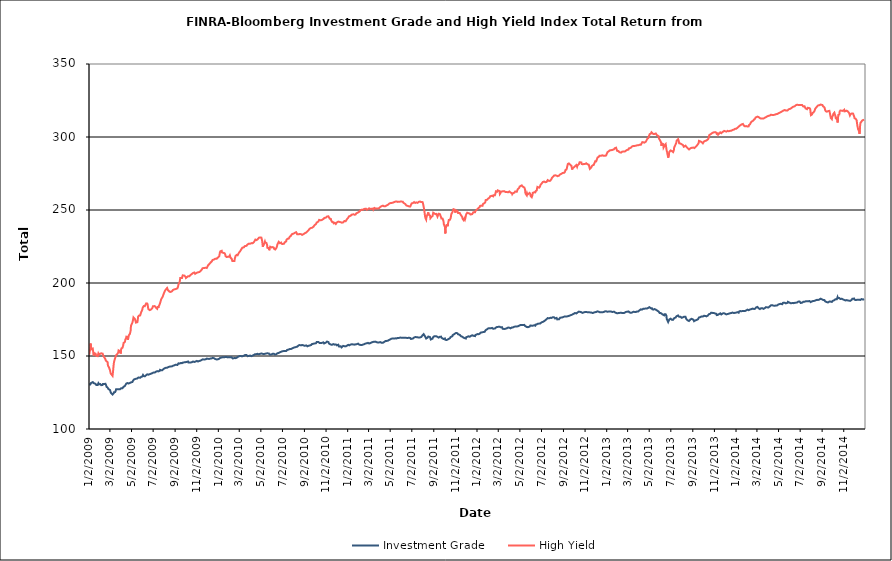
| Category | Investment Grade | High Yield |
|---|---|---|
| 1/2/09 | 130.456 | 150.901 |
| 1/5/09 | 130.524 | 154.964 |
| 1/6/09 | 131.132 | 158.55 |
| 1/7/09 | 131.476 | 157.922 |
| 1/8/09 | 131.509 | 154.548 |
| 1/9/09 | 131.899 | 155.038 |
| 1/12/09 | 132.115 | 155.09 |
| 1/13/09 | 131.98 | 153.446 |
| 1/14/09 | 131.914 | 151.292 |
| 1/15/09 | 131.418 | 150.346 |
| 1/16/09 | 131.612 | 151.994 |
| 1/20/09 | 130.898 | 151.643 |
| 1/21/09 | 130.622 | 151.062 |
| 1/22/09 | 130.169 | 150.114 |
| 1/23/09 | 130.063 | 149.528 |
| 1/26/09 | 130.187 | 149.884 |
| 1/27/09 | 130.757 | 149.946 |
| 1/28/09 | 131.377 | 151.826 |
| 1/29/09 | 130.895 | 151.693 |
| 1/30/09 | 130.625 | 150.956 |
| 2/2/09 | 130.793 | 151.521 |
| 2/3/09 | 130.475 | 151.444 |
| 2/4/09 | 130.138 | 151.704 |
| 2/5/09 | 130.041 | 151.868 |
| 2/6/09 | 130.096 | 151.844 |
| 2/9/09 | 130.196 | 151.59 |
| 2/10/09 | 130.887 | 151.416 |
| 2/11/09 | 131.304 | 150.069 |
| 2/12/09 | 131.194 | 149.768 |
| 2/13/09 | 130.865 | 149.475 |
| 2/17/09 | 130.943 | 147.774 |
| 2/18/09 | 130.406 | 146.817 |
| 2/19/09 | 129.793 | 147.231 |
| 2/20/09 | 128.916 | 146.211 |
| 2/23/09 | 128.37 | 145.794 |
| 2/24/09 | 127.803 | 143.43 |
| 2/25/09 | 127.426 | 143.418 |
| 2/26/09 | 127.198 | 143.76 |
| 2/27/09 | 127.049 | 142.136 |
| 3/2/09 | 126.633 | 140.033 |
| 3/3/09 | 126.067 | 138.861 |
| 3/4/09 | 124.893 | 137.909 |
| 3/5/09 | 124.609 | 137.847 |
| 3/6/09 | 124.444 | 137.385 |
| 3/9/09 | 123.603 | 136.385 |
| 3/10/09 | 123.655 | 138.532 |
| 3/11/09 | 124.014 | 141.298 |
| 3/12/09 | 124.461 | 143.754 |
| 3/13/09 | 125.17 | 145.832 |
| 3/16/09 | 125.255 | 148.411 |
| 3/17/09 | 125.417 | 148.524 |
| 3/18/09 | 126.205 | 148.925 |
| 3/19/09 | 127.235 | 150.542 |
| 3/20/09 | 126.981 | 150.136 |
| 3/23/09 | 127.143 | 151.604 |
| 3/24/09 | 127.1 | 151.748 |
| 3/25/09 | 127.075 | 152.349 |
| 3/26/09 | 127.22 | 153.846 |
| 3/27/09 | 127.5 | 154.41 |
| 3/30/09 | 127.215 | 153.244 |
| 3/31/09 | 127.458 | 153.056 |
| 4/1/09 | 127.54 | 151.638 |
| 4/2/09 | 127.858 | 154.221 |
| 4/3/09 | 127.69 | 155.167 |
| 4/6/09 | 127.941 | 155.661 |
| 4/7/09 | 128.085 | 156.435 |
| 4/8/09 | 128.571 | 157.282 |
| 4/9/09 | 128.913 | 158.84 |
| 4/13/09 | 129.49 | 159.761 |
| 4/14/09 | 130.04 | 161.2 |
| 4/15/09 | 130.452 | 161.157 |
| 4/16/09 | 130.89 | 162.163 |
| 4/17/09 | 131.156 | 163.249 |
| 4/20/09 | 131.458 | 163.078 |
| 4/21/09 | 131.255 | 161.127 |
| 4/22/09 | 130.991 | 161.853 |
| 4/23/09 | 131.156 | 162.265 |
| 4/24/09 | 131.448 | 164.314 |
| 4/27/09 | 131.544 | 165.134 |
| 4/28/09 | 131.549 | 165.558 |
| 4/29/09 | 131.771 | 167.449 |
| 4/30/09 | 131.931 | 170.695 |
| 5/1/09 | 131.967 | 171.124 |
| 5/4/09 | 132.202 | 172.922 |
| 5/5/09 | 132.638 | 173.874 |
| 5/6/09 | 133.139 | 175.093 |
| 5/7/09 | 133.502 | 176.426 |
| 5/8/09 | 133.846 | 176.351 |
| 5/11/09 | 134.164 | 175.384 |
| 5/12/09 | 134.441 | 174.909 |
| 5/13/09 | 134.576 | 173.862 |
| 5/14/09 | 134.423 | 172.898 |
| 5/15/09 | 134.684 | 172.875 |
| 5/18/09 | 134.628 | 173.172 |
| 5/19/09 | 134.731 | 174.565 |
| 5/20/09 | 135.279 | 176.814 |
| 5/21/09 | 135.281 | 177.011 |
| 5/22/09 | 135.232 | 177.614 |
| 5/26/09 | 135.122 | 177.787 |
| 5/27/09 | 135.109 | 178.662 |
| 5/28/09 | 135.037 | 179.161 |
| 5/29/09 | 135.789 | 180.117 |
| 6/1/09 | 135.929 | 181.755 |
| 6/2/09 | 136.467 | 183.068 |
| 6/3/09 | 137.008 | 183.074 |
| 6/4/09 | 136.751 | 183.18 |
| 6/5/09 | 136.256 | 184.222 |
| 6/8/09 | 136.087 | 184.131 |
| 6/9/09 | 136.334 | 184.338 |
| 6/10/09 | 136.37 | 185.155 |
| 6/11/09 | 136.679 | 185.691 |
| 6/12/09 | 137.069 | 186.029 |
| 6/15/09 | 137.447 | 185.922 |
| 6/16/09 | 137.536 | 185.222 |
| 6/17/09 | 137.588 | 183.478 |
| 6/18/09 | 137.196 | 182.137 |
| 6/19/09 | 137.28 | 182.406 |
| 6/22/09 | 137.56 | 181.418 |
| 6/23/09 | 137.675 | 181.047 |
| 6/24/09 | 137.663 | 181.662 |
| 6/25/09 | 137.841 | 181.764 |
| 6/26/09 | 138.148 | 182.259 |
| 6/29/09 | 138.212 | 182.695 |
| 6/30/09 | 138.199 | 183.418 |
| 7/1/09 | 138.338 | 184.147 |
| 7/2/09 | 138.614 | 184.518 |
| 7/6/09 | 138.639 | 184.164 |
| 7/7/09 | 138.83 | 184.232 |
| 7/8/09 | 139.235 | 183.552 |
| 7/9/09 | 139.219 | 183.283 |
| 7/10/09 | 139.459 | 183.161 |
| 7/13/09 | 139.614 | 182.328 |
| 7/14/09 | 139.447 | 182.985 |
| 7/15/09 | 139.134 | 184.133 |
| 7/16/09 | 139.44 | 183.072 |
| 7/17/09 | 139.508 | 183.923 |
| 7/20/09 | 139.826 | 185.422 |
| 7/21/09 | 140.532 | 186.133 |
| 7/22/09 | 140.549 | 186.258 |
| 7/23/09 | 140.265 | 187.842 |
| 7/24/09 | 140.235 | 188.784 |
| 7/27/09 | 140.241 | 189.994 |
| 7/28/09 | 140.546 | 190.525 |
| 7/29/09 | 140.825 | 190.972 |
| 7/30/09 | 140.931 | 191.652 |
| 7/31/09 | 141.596 | 192.396 |
| 8/3/09 | 141.598 | 194.166 |
| 8/4/09 | 141.658 | 194.633 |
| 8/5/09 | 141.833 | 194.773 |
| 8/6/09 | 141.89 | 195.532 |
| 8/7/09 | 141.685 | 196.147 |
| 8/10/09 | 142 | 196.565 |
| 8/11/09 | 142.22 | 196.26 |
| 8/12/09 | 142.022 | 195.203 |
| 8/13/09 | 142.374 | 195.364 |
| 8/14/09 | 142.717 | 195.22 |
| 8/17/09 | 142.709 | 193.999 |
| 8/18/09 | 142.745 | 194.058 |
| 8/19/09 | 142.782 | 193.578 |
| 8/20/09 | 142.855 | 193.879 |
| 8/21/09 | 142.676 | 193.944 |
| 8/24/09 | 142.923 | 194.371 |
| 8/25/09 | 143.181 | 194.706 |
| 8/26/09 | 143.397 | 195.118 |
| 8/27/09 | 143.367 | 195.376 |
| 8/28/09 | 143.458 | 195.784 |
| 8/31/09 | 143.651 | 195.702 |
| 9/1/09 | 143.764 | 196.012 |
| 9/2/09 | 143.95 | 195.849 |
| 9/3/09 | 144.062 | 195.85 |
| 9/4/09 | 144.013 | 196.249 |
| 9/8/09 | 143.842 | 196.32 |
| 9/9/09 | 143.816 | 196.903 |
| 9/10/09 | 144.422 | 197.708 |
| 9/11/09 | 144.954 | 199.024 |
| 9/14/09 | 144.784 | 200.449 |
| 9/15/09 | 144.87 | 201.668 |
| 9/16/09 | 145.077 | 203.376 |
| 9/17/09 | 145.163 | 203.225 |
| 9/18/09 | 145.178 | 203.449 |
| 9/21/09 | 145.104 | 203.398 |
| 9/22/09 | 145.178 | 204.464 |
| 9/23/09 | 145.291 | 205.26 |
| 9/24/09 | 145.54 | 205.056 |
| 9/25/09 | 145.466 | 204.834 |
| 9/28/09 | 145.678 | 205.029 |
| 9/29/09 | 145.639 | 205.239 |
| 9/30/09 | 145.562 | 204.688 |
| 10/1/09 | 145.797 | 204.177 |
| 10/2/09 | 145.834 | 203.433 |
| 10/5/09 | 145.996 | 204.013 |
| 10/6/09 | 146.011 | 204.636 |
| 10/7/09 | 146.196 | 204.343 |
| 10/8/09 | 146.221 | 204.647 |
| 10/9/09 | 145.532 | 204.609 |
| 10/12/09 | 145.532 | 204.674 |
| 10/13/09 | 145.867 | 204.684 |
| 10/14/09 | 145.709 | 205.33 |
| 10/15/09 | 145.52 | 205.501 |
| 10/16/09 | 145.607 | 205.842 |
| 10/19/09 | 145.776 | 206.212 |
| 10/20/09 | 146.295 | 206.698 |
| 10/21/09 | 146.128 | 206.858 |
| 10/22/09 | 146.196 | 206.873 |
| 10/23/09 | 146.066 | 206.892 |
| 10/26/09 | 145.902 | 207.187 |
| 10/27/09 | 146.185 | 207.004 |
| 10/28/09 | 146.469 | 206.288 |
| 10/29/09 | 146.193 | 206.142 |
| 10/30/09 | 146.59 | 206.237 |
| 11/2/09 | 146.64 | 207.057 |
| 11/3/09 | 146.39 | 206.57 |
| 11/4/09 | 146.221 | 206.902 |
| 11/5/09 | 146.236 | 207.278 |
| 11/6/09 | 146.445 | 207.203 |
| 11/9/09 | 146.634 | 207.531 |
| 11/10/09 | 146.805 | 207.885 |
| 11/11/09 | 146.589 | 208.128 |
| 11/12/09 | 146.802 | 208.108 |
| 11/13/09 | 146.932 | 208.309 |
| 11/16/09 | 147.389 | 209.277 |
| 11/17/09 | 147.605 | 209.729 |
| 11/18/09 | 147.63 | 210.137 |
| 11/19/09 | 147.722 | 210.127 |
| 11/20/09 | 147.644 | 210.131 |
| 11/23/09 | 147.571 | 210.276 |
| 11/24/09 | 147.8 | 210.41 |
| 11/25/09 | 147.828 | 210.711 |
| 11/27/09 | 147.758 | 210.509 |
| 11/30/09 | 148.234 | 210.268 |
| 12/1/09 | 148.215 | 210.7 |
| 12/2/09 | 148.218 | 211.242 |
| 12/3/09 | 148.048 | 211.956 |
| 12/4/09 | 147.63 | 212.174 |
| 12/7/09 | 148.001 | 212.95 |
| 12/8/09 | 148.314 | 213.098 |
| 12/9/09 | 148.379 | 213.287 |
| 12/10/09 | 148.268 | 213.83 |
| 12/11/09 | 148.096 | 214.144 |
| 12/14/09 | 148.369 | 214.803 |
| 12/15/09 | 148.247 | 215.353 |
| 12/16/09 | 148.348 | 215.754 |
| 12/17/09 | 148.73 | 215.943 |
| 12/18/09 | 148.822 | 215.797 |
| 12/21/09 | 148.384 | 216.16 |
| 12/22/09 | 148.029 | 216.437 |
| 12/23/09 | 148.052 | 216.453 |
| 12/24/09 | 147.9 | 216.689 |
| 12/28/09 | 147.631 | 216.669 |
| 12/29/09 | 147.668 | 216.976 |
| 12/30/09 | 147.94 | 217.137 |
| 12/31/09 | 147.73 | 217.398 |
| 1/4/10 | 148.138 | 218.276 |
| 1/5/10 | 148.728 | 219.533 |
| 1/6/10 | 148.687 | 220.973 |
| 1/7/10 | 148.791 | 221.667 |
| 1/8/10 | 148.871 | 221.768 |
| 1/11/10 | 148.965 | 222.058 |
| 1/12/10 | 149.302 | 220.936 |
| 1/13/10 | 149.169 | 221.002 |
| 1/14/10 | 149.16 | 220.851 |
| 1/15/10 | 149.443 | 220.69 |
| 1/19/10 | 149.142 | 220.408 |
| 1/20/10 | 149.341 | 220.144 |
| 1/21/10 | 149.537 | 219.594 |
| 1/22/10 | 149.358 | 218.364 |
| 1/25/10 | 149.258 | 217.768 |
| 1/26/10 | 149.302 | 217.635 |
| 1/27/10 | 149.185 | 218.028 |
| 1/28/10 | 149.057 | 217.984 |
| 1/29/10 | 149.097 | 217.958 |
| 2/1/10 | 149.11 | 218.038 |
| 2/2/10 | 149.242 | 218.46 |
| 2/3/10 | 149.11 | 218.924 |
| 2/4/10 | 149.181 | 218.611 |
| 2/5/10 | 149.188 | 217.3 |
| 2/8/10 | 149.118 | 216.652 |
| 2/9/10 | 148.96 | 216.199 |
| 2/10/10 | 148.733 | 215.145 |
| 2/11/10 | 148.306 | 214.966 |
| 2/12/10 | 148.631 | 215.187 |
| 2/16/10 | 148.612 | 215.148 |
| 2/17/10 | 148.607 | 216.754 |
| 2/18/10 | 148.543 | 217.542 |
| 2/19/10 | 148.518 | 218.407 |
| 2/22/10 | 148.735 | 219.255 |
| 2/23/10 | 149.048 | 218.904 |
| 2/24/10 | 149.199 | 219.077 |
| 2/25/10 | 149.317 | 219.009 |
| 2/26/10 | 149.72 | 219.579 |
| 3/1/10 | 149.806 | 220.874 |
| 3/2/10 | 149.879 | 221.253 |
| 3/3/10 | 149.999 | 221.505 |
| 3/4/10 | 150.058 | 221.754 |
| 3/5/10 | 149.837 | 222.349 |
| 3/8/10 | 149.871 | 223.336 |
| 3/9/10 | 149.986 | 223.623 |
| 3/10/10 | 149.839 | 224.107 |
| 3/11/10 | 149.843 | 224.21 |
| 3/12/10 | 150.118 | 224.465 |
| 3/15/10 | 150.237 | 224.508 |
| 3/16/10 | 150.455 | 224.314 |
| 3/17/10 | 150.685 | 225.249 |
| 3/18/10 | 150.697 | 225.602 |
| 3/19/10 | 150.695 | 225.533 |
| 3/22/10 | 150.701 | 225.49 |
| 3/23/10 | 150.774 | 225.713 |
| 3/24/10 | 150.157 | 226.224 |
| 3/25/10 | 149.904 | 226.327 |
| 3/26/10 | 149.978 | 226.844 |
| 3/29/10 | 150.108 | 226.98 |
| 3/30/10 | 150.193 | 227.317 |
| 3/31/10 | 150.422 | 227.06 |
| 4/1/10 | 150.302 | 226.854 |
| 4/5/10 | 149.89 | 227.336 |
| 4/6/10 | 149.886 | 227.114 |
| 4/7/10 | 150.166 | 227.482 |
| 4/8/10 | 150.222 | 227.201 |
| 4/9/10 | 150.367 | 227.559 |
| 4/12/10 | 150.743 | 228.013 |
| 4/13/10 | 150.977 | 228.362 |
| 4/14/10 | 151.082 | 228.862 |
| 4/15/10 | 151.197 | 229.417 |
| 4/16/10 | 151.43 | 229.746 |
| 4/19/10 | 151.29 | 229.378 |
| 4/20/10 | 151.303 | 229.613 |
| 4/21/10 | 151.516 | 229.922 |
| 4/22/10 | 151.505 | 229.786 |
| 4/23/10 | 151.187 | 230.343 |
| 4/26/10 | 151.183 | 231.026 |
| 4/27/10 | 151.518 | 230.985 |
| 4/28/10 | 151.375 | 230.656 |
| 4/29/10 | 151.484 | 231.163 |
| 4/30/10 | 151.823 | 231.044 |
| 5/3/10 | 151.714 | 231.082 |
| 5/4/10 | 151.911 | 230.704 |
| 5/5/10 | 151.871 | 229.082 |
| 5/6/10 | 151.518 | 226.956 |
| 5/7/10 | 150.982 | 224.839 |
| 5/10/10 | 151.305 | 226.831 |
| 5/11/10 | 151.261 | 226.496 |
| 5/12/10 | 151.206 | 227.638 |
| 5/13/10 | 151.488 | 228.391 |
| 5/14/10 | 151.808 | 227.589 |
| 5/17/10 | 151.785 | 227.491 |
| 5/18/10 | 151.962 | 227.398 |
| 5/19/10 | 151.883 | 226.231 |
| 5/20/10 | 151.828 | 224.056 |
| 5/21/10 | 151.576 | 223.475 |
| 5/24/10 | 151.744 | 224.018 |
| 5/25/10 | 151.254 | 222.441 |
| 5/26/10 | 151.228 | 223.388 |
| 5/27/10 | 150.909 | 224.158 |
| 5/28/10 | 151.267 | 224.872 |
| 6/1/10 | 151.166 | 224.359 |
| 6/2/10 | 151.005 | 224.369 |
| 6/3/10 | 151.087 | 224.964 |
| 6/4/10 | 151.536 | 224.598 |
| 6/7/10 | 151.568 | 224.254 |
| 6/8/10 | 151.449 | 223.379 |
| 6/9/10 | 151.431 | 223.411 |
| 6/10/10 | 151.033 | 223.391 |
| 6/11/10 | 151.068 | 222.938 |
| 6/14/10 | 151.168 | 223.8 |
| 6/15/10 | 151.237 | 224.435 |
| 6/16/10 | 151.35 | 225.145 |
| 6/17/10 | 151.85 | 226.255 |
| 6/18/10 | 151.95 | 226.827 |
| 6/21/10 | 152.099 | 228.18 |
| 6/22/10 | 152.336 | 227.899 |
| 6/23/10 | 152.544 | 227.893 |
| 6/24/10 | 152.505 | 227.317 |
| 6/25/10 | 152.512 | 227.529 |
| 6/28/10 | 152.919 | 227.662 |
| 6/29/10 | 153.088 | 226.881 |
| 6/30/10 | 153.256 | 227.281 |
| 7/1/10 | 153.26 | 226.657 |
| 7/2/10 | 153.296 | 226.726 |
| 7/6/10 | 153.401 | 226.935 |
| 7/7/10 | 153.275 | 227.239 |
| 7/8/10 | 153.332 | 227.914 |
| 7/9/10 | 153.346 | 228.3 |
| 7/12/10 | 153.406 | 228.5 |
| 7/13/10 | 153.508 | 229.676 |
| 7/14/10 | 153.54 | 229.747 |
| 7/15/10 | 154.186 | 230.02 |
| 7/16/10 | 154.45 | 230.311 |
| 7/19/10 | 154.421 | 230.396 |
| 7/20/10 | 154.571 | 230.597 |
| 7/21/10 | 154.713 | 230.948 |
| 7/22/10 | 154.81 | 231.615 |
| 7/23/10 | 154.787 | 232.159 |
| 7/26/10 | 154.819 | 232.551 |
| 7/27/10 | 154.919 | 233.167 |
| 7/28/10 | 154.953 | 233.424 |
| 7/29/10 | 155.219 | 233.158 |
| 7/30/10 | 155.681 | 233.528 |
| 8/2/10 | 155.664 | 233.845 |
| 8/3/10 | 155.934 | 234.218 |
| 8/4/10 | 155.819 | 234.224 |
| 8/5/10 | 155.907 | 234.331 |
| 8/6/10 | 156.202 | 234.611 |
| 8/9/10 | 156.185 | 234.826 |
| 8/10/10 | 156.305 | 234.462 |
| 8/11/10 | 156.415 | 234.013 |
| 8/12/10 | 156.375 | 233.324 |
| 8/13/10 | 156.5 | 233.036 |
| 8/16/10 | 157.283 | 233.307 |
| 8/17/10 | 157.199 | 233.51 |
| 8/18/10 | 157.299 | 233.735 |
| 8/19/10 | 157.491 | 233.606 |
| 8/20/10 | 157.371 | 233.25 |
| 8/23/10 | 157.306 | 233.433 |
| 8/24/10 | 157.642 | 233.185 |
| 8/25/10 | 157.604 | 233.111 |
| 8/26/10 | 157.53 | 232.964 |
| 8/27/10 | 157.001 | 233.13 |
| 8/30/10 | 157.269 | 233.482 |
| 8/31/10 | 157.502 | 233.106 |
| 9/1/10 | 157.137 | 233.487 |
| 9/2/10 | 156.997 | 233.998 |
| 9/3/10 | 156.836 | 234.431 |
| 9/7/10 | 157.25 | 234.672 |
| 9/8/10 | 157.273 | 234.77 |
| 9/9/10 | 156.872 | 235.138 |
| 9/10/10 | 156.635 | 235.369 |
| 9/13/10 | 157.002 | 236.122 |
| 9/14/10 | 157.428 | 236.022 |
| 9/15/10 | 157.367 | 236.341 |
| 9/16/10 | 157.163 | 237.106 |
| 9/17/10 | 157.231 | 237.261 |
| 9/20/10 | 157.459 | 237.686 |
| 9/21/10 | 157.688 | 238.039 |
| 9/22/10 | 158.121 | 238.12 |
| 9/23/10 | 158.207 | 237.83 |
| 9/24/10 | 157.946 | 237.943 |
| 9/27/10 | 158.387 | 238.553 |
| 9/28/10 | 158.5 | 238.76 |
| 9/29/10 | 158.556 | 239.176 |
| 9/30/10 | 158.574 | 239.596 |
| 10/1/10 | 158.719 | 239.917 |
| 10/4/10 | 158.723 | 240.343 |
| 10/5/10 | 158.915 | 240.842 |
| 10/6/10 | 159.572 | 241.409 |
| 10/7/10 | 159.662 | 241.712 |
| 10/8/10 | 159.778 | 242.02 |
| 10/11/10 | 159.647 | 242.1 |
| 10/12/10 | 159.547 | 242.33 |
| 10/13/10 | 159.368 | 243.238 |
| 10/14/10 | 158.936 | 243.015 |
| 10/15/10 | 158.56 | 242.955 |
| 10/18/10 | 158.841 | 242.956 |
| 10/19/10 | 159.018 | 242.909 |
| 10/20/10 | 159.081 | 242.726 |
| 10/21/10 | 159 | 243.221 |
| 10/22/10 | 158.985 | 243.231 |
| 10/25/10 | 159.316 | 243.831 |
| 10/26/10 | 158.883 | 244.418 |
| 10/27/10 | 158.57 | 244.341 |
| 10/28/10 | 158.749 | 244.582 |
| 10/29/10 | 159.062 | 244.452 |
| 11/1/10 | 159.158 | 244.733 |
| 11/2/10 | 159.471 | 244.362 |
| 11/3/10 | 159.656 | 244.821 |
| 11/4/10 | 159.896 | 245.495 |
| 11/5/10 | 159.653 | 245.54 |
| 11/8/10 | 159.578 | 245.717 |
| 11/9/10 | 159.213 | 245.828 |
| 11/10/10 | 158.489 | 244.84 |
| 11/11/10 | 158.591 | 244.793 |
| 11/12/10 | 158.389 | 244.031 |
| 11/15/10 | 157.814 | 243.894 |
| 11/16/10 | 157.664 | 242.835 |
| 11/17/10 | 157.963 | 242.423 |
| 11/18/10 | 157.658 | 242.693 |
| 11/19/10 | 157.922 | 241.761 |
| 11/22/10 | 158.162 | 241.668 |
| 11/23/10 | 158.357 | 240.889 |
| 11/24/10 | 157.748 | 240.806 |
| 11/26/10 | 157.77 | 241.172 |
| 11/29/10 | 157.93 | 240.436 |
| 11/30/10 | 158.106 | 240.163 |
| 12/1/10 | 157.436 | 240.816 |
| 12/2/10 | 157.319 | 241.508 |
| 12/3/10 | 157.409 | 241.776 |
| 12/6/10 | 157.748 | 242.064 |
| 12/7/10 | 157.248 | 242.309 |
| 12/8/10 | 156.543 | 241.78 |
| 12/9/10 | 156.743 | 241.89 |
| 12/10/10 | 156.679 | 241.503 |
| 12/13/10 | 156.633 | 241.636 |
| 12/14/10 | 156.258 | 241.537 |
| 12/15/10 | 155.875 | 241.161 |
| 12/16/10 | 155.864 | 241.32 |
| 12/17/10 | 156.338 | 241.362 |
| 12/20/10 | 156.934 | 241.546 |
| 12/21/10 | 156.801 | 242.022 |
| 12/22/10 | 156.866 | 242.026 |
| 12/23/10 | 156.734 | 242.402 |
| 12/27/10 | 156.592 | 242.345 |
| 12/28/10 | 156.46 | 242.906 |
| 12/29/10 | 156.734 | 243.104 |
| 12/30/10 | 157 | 243.491 |
| 12/31/10 | 157.322 | 243.889 |
| 1/3/11 | 157.626 | 244.716 |
| 1/4/11 | 157.815 | 245.187 |
| 1/5/11 | 157.257 | 245.618 |
| 1/6/11 | 157.308 | 245.993 |
| 1/7/11 | 157.728 | 245.896 |
| 1/10/11 | 157.85 | 246.09 |
| 1/11/11 | 157.862 | 246.402 |
| 1/12/11 | 157.794 | 246.55 |
| 1/13/11 | 158.013 | 246.81 |
| 1/14/11 | 158.143 | 246.922 |
| 1/18/11 | 157.91 | 247.078 |
| 1/19/11 | 158.148 | 247.099 |
| 1/20/11 | 157.779 | 246.707 |
| 1/21/11 | 157.772 | 246.716 |
| 1/24/11 | 157.98 | 246.961 |
| 1/25/11 | 158.258 | 247.578 |
| 1/26/11 | 158.002 | 247.765 |
| 1/27/11 | 158.085 | 248.289 |
| 1/28/11 | 158.333 | 247.918 |
| 1/31/11 | 158.463 | 248.319 |
| 2/1/11 | 158.167 | 248.646 |
| 2/2/11 | 158.091 | 248.934 |
| 2/3/11 | 157.788 | 248.813 |
| 2/4/11 | 157.483 | 249.293 |
| 2/7/11 | 157.584 | 249.856 |
| 2/8/11 | 157.563 | 250.164 |
| 2/9/11 | 157.528 | 250.282 |
| 2/10/11 | 157.543 | 250.22 |
| 2/11/11 | 157.651 | 250.083 |
| 2/14/11 | 157.832 | 250.194 |
| 2/15/11 | 157.905 | 250.283 |
| 2/16/11 | 157.966 | 250.519 |
| 2/17/11 | 158.084 | 250.733 |
| 2/18/11 | 158.064 | 250.911 |
| 2/22/11 | 158.645 | 250.896 |
| 2/23/11 | 158.66 | 250.602 |
| 2/24/11 | 158.475 | 250.152 |
| 2/25/11 | 158.728 | 250.286 |
| 2/28/11 | 159 | 250.537 |
| 3/1/11 | 159.151 | 250.931 |
| 3/2/11 | 159.145 | 251.083 |
| 3/3/11 | 158.534 | 251.151 |
| 3/4/11 | 158.722 | 250.995 |
| 3/7/11 | 158.888 | 250.721 |
| 3/8/11 | 158.73 | 251.313 |
| 3/9/11 | 158.992 | 251.345 |
| 3/10/11 | 159.281 | 250.84 |
| 3/11/11 | 159.453 | 250.74 |
| 3/14/11 | 159.639 | 250.996 |
| 3/15/11 | 159.696 | 250.261 |
| 3/16/11 | 160.006 | 250.243 |
| 3/17/11 | 159.744 | 250.739 |
| 3/18/11 | 159.878 | 251.393 |
| 3/21/11 | 159.836 | 251.043 |
| 3/22/11 | 159.827 | 251.203 |
| 3/23/11 | 159.71 | 250.998 |
| 3/24/11 | 159.495 | 251.104 |
| 3/25/11 | 159.317 | 250.991 |
| 3/28/11 | 159.199 | 251.006 |
| 3/29/11 | 159.016 | 251.066 |
| 3/30/11 | 159.023 | 251.431 |
| 3/31/11 | 159.304 | 251.272 |
| 4/1/11 | 159.072 | 251.92 |
| 4/4/11 | 159.53 | 252.238 |
| 4/5/11 | 159.285 | 252.698 |
| 4/6/11 | 159.11 | 252.56 |
| 4/7/11 | 159.049 | 252.574 |
| 4/8/11 | 159.041 | 252.811 |
| 4/11/11 | 159.06 | 252.995 |
| 4/12/11 | 159.391 | 252.709 |
| 4/13/11 | 159.584 | 252.682 |
| 4/14/11 | 159.56 | 252.554 |
| 4/15/11 | 159.954 | 252.893 |
| 4/18/11 | 160.215 | 252.622 |
| 4/19/11 | 160.381 | 252.671 |
| 4/20/11 | 160.362 | 252.88 |
| 4/21/11 | 160.327 | 253.09 |
| 4/25/11 | 160.449 | 253.534 |
| 4/26/11 | 160.774 | 253.773 |
| 4/27/11 | 160.593 | 253.724 |
| 4/28/11 | 160.972 | 254.275 |
| 4/29/11 | 161.184 | 254.364 |
| 5/2/11 | 161.378 | 254.711 |
| 5/3/11 | 161.544 | 254.53 |
| 5/4/11 | 161.69 | 254.875 |
| 5/5/11 | 161.863 | 254.808 |
| 5/6/11 | 161.867 | 255.155 |
| 5/9/11 | 162.019 | 255.013 |
| 5/10/11 | 161.844 | 255.551 |
| 5/11/11 | 161.91 | 255.621 |
| 5/12/11 | 161.919 | 255.348 |
| 5/13/11 | 162.003 | 255.328 |
| 5/16/11 | 162.092 | 255.735 |
| 5/17/11 | 162.436 | 255.698 |
| 5/18/11 | 162.239 | 255.708 |
| 5/19/11 | 162.04 | 255.887 |
| 5/20/11 | 162.161 | 255.759 |
| 5/23/11 | 162.38 | 255.548 |
| 5/24/11 | 162.266 | 255.706 |
| 5/25/11 | 162.212 | 255.594 |
| 5/26/11 | 162.355 | 255.674 |
| 5/27/11 | 162.427 | 256.036 |
| 5/31/11 | 162.634 | 255.76 |
| 6/1/11 | 162.928 | 255.849 |
| 6/2/11 | 162.566 | 255.591 |
| 6/3/11 | 162.489 | 255.756 |
| 6/6/11 | 162.453 | 255.667 |
| 6/7/11 | 162.401 | 255.356 |
| 6/8/11 | 162.584 | 254.91 |
| 6/9/11 | 162.504 | 254.704 |
| 6/10/11 | 162.479 | 254.634 |
| 6/13/11 | 162.452 | 254.118 |
| 6/14/11 | 162.032 | 253.948 |
| 6/15/11 | 162.272 | 253.687 |
| 6/16/11 | 162.422 | 253.138 |
| 6/17/11 | 162.412 | 253.373 |
| 6/20/11 | 162.37 | 252.794 |
| 6/21/11 | 162.429 | 252.839 |
| 6/22/11 | 162.449 | 253.214 |
| 6/23/11 | 162.527 | 252.527 |
| 6/24/11 | 162.699 | 252.693 |
| 6/27/11 | 162.361 | 252.368 |
| 6/28/11 | 161.852 | 253.028 |
| 6/29/11 | 161.652 | 253.4 |
| 6/30/11 | 161.582 | 253.619 |
| 7/1/11 | 161.664 | 254.51 |
| 7/5/11 | 162.021 | 254.798 |
| 7/6/11 | 162.135 | 255.008 |
| 7/7/11 | 161.984 | 255.276 |
| 7/8/11 | 162.646 | 255.417 |
| 7/11/11 | 162.928 | 254.826 |
| 7/12/11 | 163.078 | 254.68 |
| 7/13/11 | 163.147 | 255.054 |
| 7/14/11 | 162.932 | 255.182 |
| 7/15/11 | 162.894 | 254.981 |
| 7/18/11 | 162.779 | 254.861 |
| 7/19/11 | 162.716 | 254.905 |
| 7/20/11 | 162.937 | 255.359 |
| 7/21/11 | 162.64 | 255.583 |
| 7/22/11 | 162.835 | 255.706 |
| 7/25/11 | 162.739 | 255.818 |
| 7/26/11 | 162.87 | 256.239 |
| 7/27/11 | 162.9 | 255.731 |
| 7/28/11 | 162.985 | 255.399 |
| 7/29/11 | 163.627 | 255.056 |
| 8/1/11 | 164.219 | 255.393 |
| 8/2/11 | 164.63 | 254.416 |
| 8/3/11 | 164.773 | 253.433 |
| 8/4/11 | 164.945 | 252.108 |
| 8/5/11 | 164.443 | 251.097 |
| 8/8/11 | 163.395 | 245.602 |
| 8/9/11 | 163.141 | 244.507 |
| 8/10/11 | 163.204 | 244.486 |
| 8/11/11 | 161.985 | 243.45 |
| 8/12/11 | 162.398 | 245.222 |
| 8/15/11 | 162.572 | 247.051 |
| 8/16/11 | 162.936 | 247.363 |
| 8/17/11 | 163.319 | 248.419 |
| 8/18/11 | 163.44 | 246.821 |
| 8/19/11 | 163.205 | 246.281 |
| 8/22/11 | 162.937 | 246.179 |
| 8/23/11 | 162.18 | 244.365 |
| 8/24/11 | 161.334 | 243.738 |
| 8/25/11 | 161.636 | 244.871 |
| 8/26/11 | 161.888 | 245.33 |
| 8/29/11 | 161.931 | 245.795 |
| 8/30/11 | 162.637 | 246.122 |
| 8/31/11 | 162.878 | 248.155 |
| 9/1/11 | 163.171 | 248.397 |
| 9/2/11 | 163.433 | 248.749 |
| 9/6/11 | 163.525 | 247.181 |
| 9/7/11 | 163.501 | 247.704 |
| 9/8/11 | 163.55 | 247.68 |
| 9/9/11 | 163.455 | 247.331 |
| 9/12/11 | 163.134 | 245.486 |
| 9/13/11 | 162.81 | 245.818 |
| 9/14/11 | 162.872 | 246.767 |
| 9/15/11 | 162.604 | 247.229 |
| 9/16/11 | 162.758 | 247.457 |
| 9/19/11 | 163.176 | 247.147 |
| 9/20/11 | 163.198 | 247.421 |
| 9/21/11 | 163.313 | 247.136 |
| 9/22/11 | 163.267 | 245.042 |
| 9/23/11 | 162.556 | 244.18 |
| 9/26/11 | 162.073 | 244.218 |
| 9/27/11 | 161.715 | 244.546 |
| 9/28/11 | 161.525 | 243.141 |
| 9/29/11 | 161.625 | 242.219 |
| 9/30/11 | 161.689 | 240.219 |
| 10/3/11 | 162.004 | 238.38 |
| 10/4/11 | 161.143 | 233.908 |
| 10/5/11 | 160.886 | 235.671 |
| 10/6/11 | 160.951 | 238.602 |
| 10/7/11 | 160.961 | 239.592 |
| 10/10/11 | 161.166 | 239.899 |
| 10/11/11 | 160.928 | 238.887 |
| 10/12/11 | 161.23 | 241 |
| 10/13/11 | 161.659 | 241.617 |
| 10/14/11 | 161.731 | 243.19 |
| 10/17/11 | 162.158 | 243.24 |
| 10/18/11 | 162.533 | 243.056 |
| 10/19/11 | 163.006 | 244.34 |
| 10/20/11 | 163.27 | 245.545 |
| 10/21/11 | 163.339 | 247.234 |
| 10/24/11 | 163.572 | 248.376 |
| 10/25/11 | 164.328 | 248.912 |
| 10/26/11 | 164.52 | 248.238 |
| 10/27/11 | 164.511 | 250.561 |
| 10/28/11 | 164.72 | 250.417 |
| 10/31/11 | 165.306 | 250.216 |
| 11/1/11 | 165.588 | 248.202 |
| 11/2/11 | 165.878 | 248.888 |
| 11/3/11 | 165.715 | 249.704 |
| 11/4/11 | 165.525 | 249.34 |
| 11/7/11 | 165.647 | 249.362 |
| 11/8/11 | 165.175 | 249.684 |
| 11/9/11 | 164.87 | 247.965 |
| 11/10/11 | 164.546 | 248.191 |
| 11/11/11 | 164.675 | 248.388 |
| 11/14/11 | 164.476 | 247.916 |
| 11/15/11 | 164.016 | 247.289 |
| 11/16/11 | 164.031 | 246.969 |
| 11/17/11 | 163.585 | 246.641 |
| 11/18/11 | 163.519 | 246.23 |
| 11/21/11 | 163.224 | 245.092 |
| 11/22/11 | 162.875 | 243.879 |
| 11/23/11 | 162.664 | 243.793 |
| 11/25/11 | 162.461 | 242.969 |
| 11/28/11 | 162.222 | 244.54 |
| 11/29/11 | 162.156 | 243.804 |
| 11/30/11 | 162.163 | 244.618 |
| 12/1/11 | 161.972 | 246.167 |
| 12/2/11 | 162.826 | 247.051 |
| 12/5/11 | 163.133 | 248.137 |
| 12/6/11 | 163.241 | 248.226 |
| 12/7/11 | 163.212 | 247.919 |
| 12/8/11 | 163.503 | 247.823 |
| 12/9/11 | 163.137 | 247.71 |
| 12/12/11 | 163.2 | 247.591 |
| 12/13/11 | 163.288 | 247.331 |
| 12/14/11 | 163.464 | 246.905 |
| 12/15/11 | 163.704 | 247.047 |
| 12/16/11 | 164.017 | 247.285 |
| 12/19/11 | 164.19 | 247.198 |
| 12/20/11 | 163.925 | 247.708 |
| 12/21/11 | 163.789 | 247.851 |
| 12/22/11 | 163.874 | 248.444 |
| 12/23/11 | 163.706 | 248.74 |
| 12/27/11 | 163.62 | 248.467 |
| 12/28/11 | 164.409 | 249.294 |
| 12/29/11 | 164.65 | 249.693 |
| 12/30/11 | 165.028 | 249.97 |
| 1/3/12 | 165 | 250.715 |
| 1/4/12 | 164.79 | 250.779 |
| 1/5/12 | 164.735 | 251.086 |
| 1/6/12 | 164.96 | 251.448 |
| 1/9/12 | 165.268 | 251.961 |
| 1/10/12 | 165.441 | 252.742 |
| 1/11/12 | 165.803 | 252.832 |
| 1/12/12 | 166.032 | 253.184 |
| 1/13/12 | 166.183 | 253.02 |
| 1/17/12 | 166.274 | 252.866 |
| 1/18/12 | 166.444 | 253.06 |
| 1/19/12 | 166.456 | 254.263 |
| 1/20/12 | 166.437 | 254.397 |
| 1/23/12 | 166.529 | 254.743 |
| 1/24/12 | 166.417 | 254.88 |
| 1/25/12 | 166.929 | 255.446 |
| 1/26/12 | 167.686 | 256.822 |
| 1/27/12 | 167.976 | 256.959 |
| 1/30/12 | 168.315 | 257.005 |
| 1/31/12 | 168.58 | 256.808 |
| 2/1/12 | 168.573 | 257.523 |
| 2/2/12 | 168.91 | 257.778 |
| 2/3/12 | 168.745 | 257.951 |
| 2/6/12 | 169.019 | 258.538 |
| 2/7/12 | 168.872 | 258.607 |
| 2/8/12 | 169.153 | 259.455 |
| 2/9/12 | 168.938 | 259.817 |
| 2/10/12 | 169.066 | 259.132 |
| 2/13/12 | 169.249 | 259.743 |
| 2/14/12 | 169.29 | 259.486 |
| 2/15/12 | 169.329 | 259.581 |
| 2/16/12 | 168.702 | 259.357 |
| 2/17/12 | 168.808 | 260.074 |
| 2/21/12 | 168.807 | 260.076 |
| 2/22/12 | 169.006 | 260.884 |
| 2/23/12 | 169.182 | 261.495 |
| 2/24/12 | 169.517 | 262.8 |
| 2/27/12 | 169.832 | 262.498 |
| 2/28/12 | 170.084 | 262.863 |
| 2/29/12 | 170.208 | 263.462 |
| 3/1/12 | 169.958 | 263.656 |
| 3/2/12 | 170.404 | 263.482 |
| 3/5/12 | 170.096 | 262.963 |
| 3/6/12 | 169.911 | 260.954 |
| 3/7/12 | 169.867 | 261.475 |
| 3/8/12 | 169.702 | 261.711 |
| 3/9/12 | 169.585 | 262.512 |
| 3/12/12 | 169.759 | 262.676 |
| 3/13/12 | 169.338 | 262.921 |
| 3/14/12 | 168.604 | 263.168 |
| 3/15/12 | 168.553 | 262.878 |
| 3/16/12 | 168.639 | 262.992 |
| 3/19/12 | 168.542 | 262.878 |
| 3/20/12 | 168.348 | 262.477 |
| 3/21/12 | 168.765 | 262.877 |
| 3/22/12 | 168.674 | 262.254 |
| 3/23/12 | 168.965 | 262.017 |
| 3/26/12 | 169.026 | 262.319 |
| 3/27/12 | 169.446 | 262.573 |
| 3/28/12 | 169.432 | 262.566 |
| 3/29/12 | 169.464 | 262.104 |
| 3/30/12 | 169.412 | 262.581 |
| 4/2/12 | 169.408 | 262.705 |
| 4/3/12 | 169.271 | 262.827 |
| 4/4/12 | 168.83 | 262.433 |
| 4/5/12 | 168.956 | 262 |
| 4/9/12 | 169.563 | 261.491 |
| 4/10/12 | 169.66 | 260.789 |
| 4/11/12 | 169.504 | 260.797 |
| 4/12/12 | 169.575 | 261.504 |
| 4/13/12 | 169.893 | 261.894 |
| 4/16/12 | 170.079 | 261.862 |
| 4/17/12 | 169.995 | 262.478 |
| 4/18/12 | 170.068 | 262.661 |
| 4/19/12 | 170.194 | 262.593 |
| 4/20/12 | 170.075 | 262.792 |
| 4/23/12 | 170.258 | 262.506 |
| 4/24/12 | 170.151 | 263.114 |
| 4/25/12 | 170.052 | 263.997 |
| 4/26/12 | 170.32 | 264.193 |
| 4/27/12 | 170.504 | 264.573 |
| 4/30/12 | 170.798 | 265.38 |
| 5/1/12 | 170.791 | 266.079 |
| 5/2/12 | 171.05 | 266.388 |
| 5/3/12 | 171.183 | 266.464 |
| 5/4/12 | 171.332 | 266.529 |
| 5/7/12 | 171.284 | 266.86 |
| 5/8/12 | 171.473 | 266.486 |
| 5/9/12 | 171.253 | 266.124 |
| 5/10/12 | 171.161 | 266.473 |
| 5/11/12 | 171.321 | 266.48 |
| 5/14/12 | 171.318 | 265.403 |
| 5/15/12 | 171.144 | 265.259 |
| 5/16/12 | 170.604 | 264.152 |
| 5/17/12 | 170.27 | 261.717 |
| 5/18/12 | 169.962 | 260.994 |
| 5/21/12 | 169.887 | 259.995 |
| 5/22/12 | 169.745 | 261.241 |
| 5/23/12 | 169.888 | 260.549 |
| 5/24/12 | 169.74 | 260.698 |
| 5/25/12 | 169.974 | 261.09 |
| 5/29/12 | 170.104 | 261.678 |
| 5/30/12 | 170.523 | 261.215 |
| 5/31/12 | 170.894 | 260.94 |
| 6/1/12 | 171.018 | 259.478 |
| 6/4/12 | 170.775 | 258.736 |
| 6/5/12 | 170.482 | 258.384 |
| 6/6/12 | 170.426 | 260.187 |
| 6/7/12 | 170.775 | 261.74 |
| 6/8/12 | 170.965 | 261.457 |
| 6/11/12 | 171.032 | 262.151 |
| 6/12/12 | 170.646 | 261.8 |
| 6/13/12 | 170.807 | 262.045 |
| 6/14/12 | 170.791 | 262.064 |
| 6/15/12 | 171.482 | 262.908 |
| 6/18/12 | 171.637 | 263.399 |
| 6/19/12 | 171.659 | 264.743 |
| 6/20/12 | 171.768 | 265.827 |
| 6/21/12 | 172.115 | 265.94 |
| 6/22/12 | 172.025 | 265.728 |
| 6/25/12 | 172.199 | 265.279 |
| 6/26/12 | 172.058 | 265.524 |
| 6/27/12 | 172.152 | 265.968 |
| 6/28/12 | 172.304 | 266.213 |
| 6/29/12 | 172.257 | 267.309 |
| 7/2/12 | 173.09 | 268.096 |
| 7/3/12 | 173.221 | 268.752 |
| 7/5/12 | 173.316 | 269.146 |
| 7/6/12 | 173.56 | 269.538 |
| 7/9/12 | 173.833 | 269.493 |
| 7/10/12 | 174.086 | 269.579 |
| 7/11/12 | 174.259 | 269.722 |
| 7/12/12 | 174.453 | 269.04 |
| 7/13/12 | 174.699 | 269.154 |
| 7/16/12 | 175.24 | 269.239 |
| 7/17/12 | 175.328 | 269.334 |
| 7/18/12 | 175.845 | 269.69 |
| 7/19/12 | 175.973 | 270.505 |
| 7/20/12 | 175.936 | 270.235 |
| 7/23/12 | 175.822 | 269.894 |
| 7/24/12 | 176.004 | 269.604 |
| 7/25/12 | 176.025 | 269.406 |
| 7/26/12 | 176.118 | 270.041 |
| 7/27/12 | 175.687 | 270.63 |
| 7/30/12 | 176.107 | 271.303 |
| 7/31/12 | 176.44 | 272.05 |
| 8/1/12 | 176.338 | 272.672 |
| 8/2/12 | 176.512 | 272.465 |
| 8/3/12 | 176.119 | 272.799 |
| 8/6/12 | 176.532 | 273.572 |
| 8/7/12 | 176.104 | 274.005 |
| 8/8/12 | 175.944 | 273.748 |
| 8/9/12 | 175.686 | 273.786 |
| 8/10/12 | 176.002 | 273.401 |
| 8/13/12 | 176.09 | 273.532 |
| 8/14/12 | 175.65 | 273.594 |
| 8/15/12 | 175.071 | 273.101 |
| 8/16/12 | 174.906 | 273.147 |
| 8/17/12 | 174.987 | 273.072 |
| 8/20/12 | 175.143 | 273.57 |
| 8/21/12 | 175.21 | 274.034 |
| 8/22/12 | 175.778 | 274.203 |
| 8/23/12 | 176.169 | 274.362 |
| 8/24/12 | 176.127 | 274.551 |
| 8/27/12 | 176.358 | 274.825 |
| 8/28/12 | 176.454 | 275.031 |
| 8/29/12 | 176.284 | 274.914 |
| 8/30/12 | 176.477 | 275.32 |
| 8/31/12 | 176.81 | 275.392 |
| 9/4/12 | 177.032 | 275.567 |
| 9/5/12 | 176.91 | 275.631 |
| 9/6/12 | 176.68 | 276.312 |
| 9/7/12 | 177.103 | 277.344 |
| 9/10/12 | 177.002 | 277.72 |
| 9/11/12 | 177.098 | 278.556 |
| 9/12/12 | 177.05 | 279.736 |
| 9/13/12 | 177.212 | 280.396 |
| 9/14/12 | 177.169 | 281.535 |
| 9/17/12 | 177.454 | 281.887 |
| 9/18/12 | 177.646 | 281.586 |
| 9/19/12 | 177.912 | 281.618 |
| 9/20/12 | 177.78 | 281.149 |
| 9/21/12 | 177.838 | 281.063 |
| 9/24/12 | 178.1 | 280.276 |
| 9/25/12 | 178.087 | 279.718 |
| 9/26/12 | 178.216 | 277.714 |
| 9/27/12 | 178.469 | 278.535 |
| 9/28/12 | 178.688 | 278.908 |
| 10/1/12 | 178.975 | 279.276 |
| 10/2/12 | 179.149 | 279.208 |
| 10/3/12 | 179.331 | 279.587 |
| 10/4/12 | 179.471 | 279.992 |
| 10/5/12 | 179.287 | 280.375 |
| 10/8/12 | 179.17 | 280.811 |
| 10/9/12 | 179.42 | 280.214 |
| 10/10/12 | 179.403 | 279.596 |
| 10/11/12 | 179.787 | 280.444 |
| 10/12/12 | 180.286 | 280.729 |
| 10/15/12 | 180.386 | 281.353 |
| 10/16/12 | 180.411 | 281.917 |
| 10/17/12 | 180.427 | 282.705 |
| 10/18/12 | 180.252 | 282.93 |
| 10/19/12 | 180.181 | 282.592 |
| 10/22/12 | 179.984 | 282.579 |
| 10/23/12 | 179.808 | 281.491 |
| 10/24/12 | 179.787 | 281.88 |
| 10/25/12 | 179.532 | 282.013 |
| 10/26/12 | 179.776 | 281.343 |
| 10/29/12 | 179.874 | 281.464 |
| 10/30/12 | 179.896 | 281.521 |
| 10/31/12 | 180.158 | 281.409 |
| 11/1/12 | 180.105 | 281.505 |
| 11/2/12 | 180.019 | 281.845 |
| 11/5/12 | 180.13 | 282.006 |
| 11/6/12 | 179.794 | 282.389 |
| 11/7/12 | 179.95 | 281.412 |
| 11/8/12 | 180.011 | 281.342 |
| 11/9/12 | 179.956 | 280.712 |
| 11/12/12 | 179.993 | 281.011 |
| 11/13/12 | 180.036 | 279.914 |
| 11/14/12 | 180.015 | 279.447 |
| 11/15/12 | 179.863 | 278.145 |
| 11/16/12 | 179.799 | 277.878 |
| 11/19/12 | 179.795 | 279.127 |
| 11/20/12 | 179.615 | 279.948 |
| 11/21/12 | 179.343 | 280.164 |
| 11/23/12 | 179.415 | 280.637 |
| 11/26/12 | 179.727 | 280.898 |
| 11/27/12 | 179.835 | 281.598 |
| 11/28/12 | 179.951 | 281.767 |
| 11/29/12 | 179.975 | 282.593 |
| 11/30/12 | 180.118 | 283.394 |
| 12/3/12 | 180.152 | 283.319 |
| 12/4/12 | 180.225 | 283.828 |
| 12/5/12 | 180.496 | 284.899 |
| 12/6/12 | 180.562 | 285.395 |
| 12/7/12 | 180.315 | 286.027 |
| 12/10/12 | 180.348 | 286.385 |
| 12/11/12 | 180.223 | 286.768 |
| 12/12/12 | 180.123 | 287.14 |
| 12/13/12 | 179.907 | 287.331 |
| 12/14/12 | 180.071 | 287.179 |
| 12/17/12 | 179.933 | 287.169 |
| 12/18/12 | 179.627 | 287.436 |
| 12/19/12 | 179.934 | 287.562 |
| 12/20/12 | 179.999 | 287.474 |
| 12/21/12 | 180.203 | 286.963 |
| 12/24/12 | 180.079 | 287.133 |
| 12/26/12 | 180.197 | 286.749 |
| 12/27/12 | 180.542 | 287.091 |
| 12/28/12 | 180.711 | 287.206 |
| 12/31/12 | 180.615 | 287.373 |
| 1/2/13 | 180.418 | 288.714 |
| 1/3/13 | 180.314 | 289.229 |
| 1/4/13 | 180.218 | 289.691 |
| 1/7/13 | 180.416 | 290.115 |
| 1/8/13 | 180.534 | 290.229 |
| 1/9/13 | 180.497 | 290.492 |
| 1/10/13 | 180.403 | 290.811 |
| 1/11/13 | 180.366 | 291.068 |
| 1/14/13 | 180.474 | 290.972 |
| 1/15/13 | 180.457 | 290.556 |
| 1/16/13 | 180.451 | 290.825 |
| 1/17/13 | 180.126 | 291.101 |
| 1/18/13 | 180.262 | 291.424 |
| 1/22/13 | 180.359 | 291.542 |
| 1/23/13 | 180.414 | 291.942 |
| 1/24/13 | 180.258 | 292.239 |
| 1/25/13 | 179.88 | 292.639 |
| 1/28/13 | 179.528 | 292.699 |
| 1/29/13 | 179.475 | 291.968 |
| 1/30/13 | 179.216 | 291.435 |
| 1/31/13 | 179.282 | 290.547 |
| 2/1/13 | 179.319 | 290.795 |
| 2/4/13 | 179.396 | 290.328 |
| 2/5/13 | 179.186 | 289.927 |
| 2/6/13 | 179.33 | 289.626 |
| 2/7/13 | 179.53 | 289.348 |
| 2/8/13 | 179.424 | 289.123 |
| 2/11/13 | 179.601 | 289.312 |
| 2/12/13 | 179.432 | 289.517 |
| 2/13/13 | 179.276 | 289.685 |
| 2/14/13 | 179.47 | 289.903 |
| 2/15/13 | 179.428 | 289.938 |
| 2/19/13 | 179.436 | 290.138 |
| 2/20/13 | 179.393 | 290.311 |
| 2/21/13 | 179.67 | 289.894 |
| 2/22/13 | 179.791 | 290.126 |
| 2/25/13 | 180.195 | 290.674 |
| 2/26/13 | 180.36 | 290.49 |
| 2/27/13 | 180.275 | 290.647 |
| 2/28/13 | 180.295 | 291.129 |
| 3/1/13 | 180.498 | 291.056 |
| 3/4/13 | 180.547 | 291.371 |
| 3/5/13 | 180.405 | 292.183 |
| 3/6/13 | 180.162 | 292.263 |
| 3/7/13 | 179.864 | 292.342 |
| 3/8/13 | 179.491 | 292.364 |
| 3/11/13 | 179.561 | 292.71 |
| 3/12/13 | 179.833 | 292.986 |
| 3/13/13 | 179.763 | 292.997 |
| 3/14/13 | 179.781 | 293.521 |
| 3/15/13 | 180.017 | 293.66 |
| 3/18/13 | 180.309 | 293.843 |
| 3/19/13 | 180.56 | 293.925 |
| 3/20/13 | 180.234 | 294.009 |
| 3/21/13 | 180.19 | 293.882 |
| 3/22/13 | 180.169 | 293.97 |
| 3/25/13 | 180.202 | 294.027 |
| 3/26/13 | 180.105 | 293.998 |
| 3/27/13 | 180.419 | 294.128 |
| 3/28/13 | 180.443 | 294.272 |
| 4/1/13 | 180.531 | 294.371 |
| 4/2/13 | 180.461 | 294.579 |
| 4/3/13 | 180.789 | 294.607 |
| 4/4/13 | 181.285 | 294.648 |
| 4/5/13 | 181.945 | 294.632 |
| 4/8/13 | 182.004 | 294.735 |
| 4/9/13 | 182.049 | 295.329 |
| 4/10/13 | 181.764 | 295.607 |
| 4/11/13 | 181.777 | 296.149 |
| 4/12/13 | 182.134 | 296.506 |
| 4/15/13 | 182.382 | 296.343 |
| 4/16/13 | 182.309 | 296.556 |
| 4/17/13 | 182.364 | 296.241 |
| 4/18/13 | 182.416 | 296.14 |
| 4/19/13 | 182.332 | 296.394 |
| 4/22/13 | 182.498 | 296.78 |
| 4/23/13 | 182.612 | 297.392 |
| 4/24/13 | 182.699 | 297.751 |
| 4/25/13 | 182.517 | 298.19 |
| 4/26/13 | 182.907 | 298.71 |
| 4/29/13 | 183.005 | 299.268 |
| 4/30/13 | 183.021 | 300.067 |
| 5/1/13 | 183.331 | 300.856 |
| 5/2/13 | 183.461 | 301.386 |
| 5/3/13 | 182.88 | 301.968 |
| 5/6/13 | 182.703 | 302.267 |
| 5/7/13 | 182.682 | 302.749 |
| 5/8/13 | 182.755 | 303.216 |
| 5/9/13 | 182.747 | 303.174 |
| 5/10/13 | 182.048 | 302.716 |
| 5/13/13 | 181.775 | 302.027 |
| 5/14/13 | 181.74 | 301.767 |
| 5/15/13 | 181.725 | 301.705 |
| 5/16/13 | 182.182 | 302.013 |
| 5/17/13 | 181.879 | 302.136 |
| 5/20/13 | 181.74 | 302.424 |
| 5/21/13 | 181.831 | 302.406 |
| 5/22/13 | 181.51 | 302.291 |
| 5/23/13 | 181.254 | 301.321 |
| 5/24/13 | 181.269 | 300.988 |
| 5/28/13 | 180.478 | 300.573 |
| 5/29/13 | 179.983 | 298.941 |
| 5/30/13 | 179.917 | 298.874 |
| 5/31/13 | 179.394 | 298.159 |
| 6/3/13 | 179.454 | 296.868 |
| 6/4/13 | 179.162 | 296.146 |
| 6/5/13 | 178.829 | 293.959 |
| 6/6/13 | 178.861 | 293.342 |
| 6/7/13 | 178.695 | 295.478 |
| 6/10/13 | 178.13 | 295.107 |
| 6/11/13 | 177.577 | 292.825 |
| 6/12/13 | 177.663 | 293.39 |
| 6/13/13 | 177.842 | 292.841 |
| 6/14/13 | 178.613 | 294.18 |
| 6/17/13 | 178.554 | 295.091 |
| 6/18/13 | 178.04 | 294.81 |
| 6/19/13 | 177.631 | 294.581 |
| 6/20/13 | 175.366 | 290.384 |
| 6/21/13 | 174.752 | 289.646 |
| 6/24/13 | 173.249 | 285.828 |
| 6/25/13 | 173.543 | 286.221 |
| 6/26/13 | 174.232 | 287.65 |
| 6/27/13 | 174.959 | 289.73 |
| 6/28/13 | 175.137 | 290.228 |
| 7/1/13 | 175.576 | 290.788 |
| 7/2/13 | 175.941 | 291.105 |
| 7/3/13 | 175.988 | 290.585 |
| 7/5/13 | 174.738 | 290.273 |
| 7/8/13 | 174.822 | 289.667 |
| 7/9/13 | 175.184 | 290.346 |
| 7/10/13 | 175.151 | 290.844 |
| 7/11/13 | 175.898 | 292.926 |
| 7/12/13 | 176.14 | 293.609 |
| 7/15/13 | 176.351 | 294.919 |
| 7/16/13 | 176.666 | 295.47 |
| 7/17/13 | 177.121 | 296.161 |
| 7/18/13 | 177.12 | 297.519 |
| 7/19/13 | 177.42 | 297.862 |
| 7/22/13 | 177.769 | 298.556 |
| 7/23/13 | 177.698 | 298.585 |
| 7/24/13 | 176.991 | 297.183 |
| 7/25/13 | 176.669 | 295.729 |
| 7/26/13 | 177.005 | 295.673 |
| 7/29/13 | 176.886 | 295.5 |
| 7/30/13 | 176.857 | 295.631 |
| 7/31/13 | 176.508 | 295.054 |
| 8/1/13 | 176.191 | 295.026 |
| 8/2/13 | 176.666 | 294.693 |
| 8/5/13 | 176.529 | 294.436 |
| 8/6/13 | 176.451 | 293.84 |
| 8/7/13 | 176.654 | 293.33 |
| 8/8/13 | 176.91 | 293.6 |
| 8/9/13 | 176.889 | 293.805 |
| 8/12/13 | 176.834 | 294.05 |
| 8/13/13 | 176.01 | 293.634 |
| 8/14/13 | 175.868 | 293.796 |
| 8/15/13 | 175.063 | 293.112 |
| 8/16/13 | 174.752 | 292.875 |
| 8/19/13 | 174.276 | 292.095 |
| 8/20/13 | 174.561 | 291.862 |
| 8/21/13 | 174.282 | 291.78 |
| 8/22/13 | 173.987 | 291.473 |
| 8/23/13 | 174.557 | 291.996 |
| 8/26/13 | 175.088 | 292.307 |
| 8/27/13 | 175.55 | 292.162 |
| 8/28/13 | 175.33 | 292.241 |
| 8/29/13 | 175.469 | 292.563 |
| 8/30/13 | 175.752 | 293.08 |
| 9/3/13 | 174.857 | 292.778 |
| 9/4/13 | 174.803 | 292.764 |
| 9/5/13 | 173.839 | 292.314 |
| 9/6/13 | 174.212 | 292.438 |
| 9/9/13 | 174.432 | 293.107 |
| 9/10/13 | 174.027 | 293 |
| 9/11/13 | 174.23 | 293.246 |
| 9/12/13 | 174.624 | 293.821 |
| 9/13/13 | 174.528 | 294.088 |
| 9/16/13 | 175.136 | 295.082 |
| 9/17/13 | 175.056 | 295.217 |
| 9/18/13 | 175.426 | 295.876 |
| 9/19/13 | 176.394 | 297.362 |
| 9/20/13 | 176.442 | 297.438 |
| 9/23/13 | 176.64 | 296.94 |
| 9/24/13 | 177.073 | 297.042 |
| 9/25/13 | 177.29 | 296.788 |
| 9/26/13 | 177.116 | 296.649 |
| 9/27/13 | 177.17 | 296.298 |
| 9/30/13 | 177.029 | 295.684 |
| 10/1/13 | 177.035 | 296.078 |
| 10/2/13 | 177.315 | 296.334 |
| 10/3/13 | 177.535 | 296.928 |
| 10/4/13 | 177.247 | 297.16 |
| 10/7/13 | 177.419 | 297.396 |
| 10/8/13 | 177.369 | 297.091 |
| 10/9/13 | 177.218 | 296.983 |
| 10/10/13 | 177.152 | 297.583 |
| 10/11/13 | 177.569 | 298.016 |
| 10/14/13 | 177.705 | 298.362 |
| 10/15/13 | 177.422 | 298.46 |
| 10/16/13 | 177.683 | 299.078 |
| 10/17/13 | 178.623 | 300.339 |
| 10/18/13 | 179.055 | 301.275 |
| 10/21/13 | 178.946 | 301.75 |
| 10/22/13 | 179.5 | 302.295 |
| 10/23/13 | 179.642 | 302.152 |
| 10/24/13 | 179.451 | 302.314 |
| 10/25/13 | 179.509 | 302.45 |
| 10/28/13 | 179.497 | 302.947 |
| 10/29/13 | 179.506 | 303.014 |
| 10/30/13 | 179.7 | 303.179 |
| 10/31/13 | 179.418 | 303.199 |
| 11/1/13 | 179.055 | 302.946 |
| 11/4/13 | 179.086 | 303.346 |
| 11/5/13 | 178.619 | 302.838 |
| 11/6/13 | 178.743 | 302.912 |
| 11/7/13 | 178.912 | 302.935 |
| 11/8/13 | 178.027 | 302.168 |
| 11/11/13 | 178.148 | 302.481 |
| 11/12/13 | 177.732 | 301.574 |
| 11/13/13 | 178.044 | 301.25 |
| 11/14/13 | 178.581 | 301.928 |
| 11/15/13 | 178.699 | 302.34 |
| 11/18/13 | 179.216 | 303.154 |
| 11/19/13 | 179.056 | 303.064 |
| 11/20/13 | 178.763 | 302.951 |
| 11/21/13 | 178.483 | 302.637 |
| 11/22/13 | 178.866 | 303.162 |
| 11/25/13 | 179.18 | 303.49 |
| 11/26/13 | 179.447 | 303.451 |
| 11/27/13 | 179.295 | 303.964 |
| 11/29/13 | 179.243 | 304.187 |
| 12/2/13 | 178.936 | 303.959 |
| 12/3/13 | 179.077 | 304.022 |
| 12/4/13 | 178.638 | 303.759 |
| 12/5/13 | 178.482 | 303.661 |
| 12/6/13 | 178.524 | 303.958 |
| 12/9/13 | 178.794 | 304.229 |
| 12/10/13 | 179.26 | 304.454 |
| 12/11/13 | 179.244 | 304.384 |
| 12/12/13 | 178.971 | 303.923 |
| 12/13/13 | 179.064 | 304.033 |
| 12/16/13 | 179.328 | 304.232 |
| 12/17/13 | 179.548 | 304.208 |
| 12/18/13 | 179.531 | 304.127 |
| 12/19/13 | 179.415 | 304.237 |
| 12/20/13 | 179.659 | 304.524 |
| 12/23/13 | 179.774 | 304.868 |
| 12/24/13 | 179.596 | 304.866 |
| 12/26/13 | 179.421 | 304.99 |
| 12/27/13 | 179.346 | 305.23 |
| 12/30/13 | 179.619 | 305.626 |
| 12/31/13 | 179.735 | 305.727 |
| 1/2/14 | 179.728 | 305.662 |
| 1/3/14 | 179.753 | 305.864 |
| 1/6/14 | 180.039 | 306.408 |
| 1/7/14 | 180.116 | 306.94 |
| 1/8/14 | 179.579 | 306.969 |
| 1/9/14 | 179.671 | 307.098 |
| 1/10/14 | 180.4 | 307.505 |
| 1/13/14 | 180.811 | 307.909 |
| 1/14/14 | 180.596 | 307.963 |
| 1/15/14 | 180.41 | 308.397 |
| 1/16/14 | 180.672 | 308.499 |
| 1/17/14 | 180.742 | 308.963 |
| 1/21/14 | 180.804 | 308.937 |
| 1/22/14 | 180.542 | 309.084 |
| 1/23/14 | 180.718 | 308.76 |
| 1/24/14 | 180.846 | 307.697 |
| 1/27/14 | 180.803 | 307.291 |
| 1/28/14 | 180.86 | 307.421 |
| 1/29/14 | 181.147 | 307.34 |
| 1/30/14 | 181.221 | 307.5 |
| 1/31/14 | 181.355 | 307.291 |
| 2/3/14 | 181.763 | 307.131 |
| 2/4/14 | 181.689 | 307.001 |
| 2/5/14 | 181.423 | 306.844 |
| 2/6/14 | 181.395 | 307.294 |
| 2/7/14 | 181.768 | 308.141 |
| 2/10/14 | 181.871 | 308.736 |
| 2/11/14 | 181.686 | 309.108 |
| 2/12/14 | 181.564 | 309.671 |
| 2/13/14 | 182.068 | 309.957 |
| 2/14/14 | 182.2 | 310.47 |
| 2/18/14 | 182.466 | 310.993 |
| 2/19/14 | 182.465 | 311.258 |
| 2/20/14 | 182.013 | 311.434 |
| 2/21/14 | 182.187 | 311.855 |
| 2/24/14 | 182.309 | 312.532 |
| 2/25/14 | 182.786 | 313.061 |
| 2/26/14 | 182.966 | 313.386 |
| 2/27/14 | 183.242 | 313.688 |
| 2/28/14 | 183.242 | 313.95 |
| 3/3/14 | 183.617 | 313.958 |
| 3/4/14 | 183.201 | 314.086 |
| 3/5/14 | 183.098 | 314.146 |
| 3/6/14 | 182.707 | 313.68 |
| 3/7/14 | 182.162 | 313.23 |
| 3/10/14 | 182.161 | 312.94 |
| 3/11/14 | 182.18 | 312.996 |
| 3/12/14 | 182.373 | 312.805 |
| 3/13/14 | 182.68 | 312.601 |
| 3/14/14 | 182.791 | 312.17 |
| 3/17/14 | 182.764 | 312.694 |
| 3/18/14 | 182.841 | 312.994 |
| 3/19/14 | 182.684 | 313.321 |
| 3/20/14 | 182.283 | 312.665 |
| 3/21/14 | 182.579 | 313.2 |
| 3/24/14 | 182.821 | 313.213 |
| 3/25/14 | 182.966 | 313.327 |
| 3/26/14 | 183.239 | 313.866 |
| 3/27/14 | 183.453 | 313.624 |
| 3/28/14 | 183.28 | 313.939 |
| 3/31/14 | 183.295 | 314.186 |
| 4/1/14 | 183.326 | 314.175 |
| 4/2/14 | 182.944 | 314.368 |
| 4/3/14 | 183.181 | 314.462 |
| 4/4/14 | 183.667 | 314.772 |
| 4/7/14 | 184.06 | 314.72 |
| 4/8/14 | 184.138 | 314.878 |
| 4/9/14 | 184.201 | 315.146 |
| 4/10/14 | 184.696 | 315.282 |
| 4/11/14 | 184.791 | 314.863 |
| 4/14/14 | 184.777 | 315.029 |
| 4/15/14 | 184.821 | 314.902 |
| 4/16/14 | 184.74 | 315.02 |
| 4/17/14 | 184.509 | 315.085 |
| 4/21/14 | 184.449 | 315.235 |
| 4/22/14 | 184.345 | 315.366 |
| 4/23/14 | 184.609 | 315.544 |
| 4/24/14 | 184.557 | 315.604 |
| 4/25/14 | 184.79 | 315.711 |
| 4/28/14 | 184.686 | 315.777 |
| 4/29/14 | 184.555 | 315.908 |
| 4/30/14 | 184.879 | 316.245 |
| 5/1/14 | 185.332 | 316.202 |
| 5/2/14 | 185.496 | 316.636 |
| 5/5/14 | 185.588 | 316.655 |
| 5/6/14 | 185.606 | 316.793 |
| 5/7/14 | 185.64 | 316.933 |
| 5/8/14 | 185.782 | 317.079 |
| 5/9/14 | 185.695 | 317.384 |
| 5/12/14 | 185.477 | 317.601 |
| 5/13/14 | 185.77 | 317.893 |
| 5/14/14 | 186.391 | 318.157 |
| 5/15/14 | 186.658 | 318.079 |
| 5/16/14 | 186.536 | 318.037 |
| 5/19/14 | 186.535 | 318.482 |
| 5/20/14 | 186.465 | 318.324 |
| 5/21/14 | 186.201 | 318.324 |
| 5/22/14 | 186.056 | 318.13 |
| 5/23/14 | 186.327 | 318.26 |
| 5/27/14 | 186.419 | 318.216 |
| 5/28/14 | 187.106 | 318.396 |
| 5/29/14 | 187.185 | 318.6 |
| 5/30/14 | 186.936 | 318.99 |
| 6/2/14 | 186.525 | 319.196 |
| 6/3/14 | 186.096 | 318.824 |
| 6/4/14 | 185.923 | 318.923 |
| 6/5/14 | 186.096 | 319.519 |
| 6/6/14 | 186.357 | 319.906 |
| 6/9/14 | 186.269 | 320.267 |
| 6/10/14 | 186.071 | 320.527 |
| 6/11/14 | 186.117 | 320.701 |
| 6/12/14 | 186.209 | 320.732 |
| 6/13/14 | 186.298 | 320.741 |
| 6/16/14 | 186.394 | 321.02 |
| 6/17/14 | 186.061 | 320.916 |
| 6/18/14 | 186.227 | 321.023 |
| 6/19/14 | 186.477 | 321.712 |
| 6/20/14 | 186.358 | 321.828 |
| 6/23/14 | 186.687 | 322.129 |
| 6/24/14 | 186.768 | 322.229 |
| 6/25/14 | 187.112 | 322.061 |
| 6/26/14 | 187.237 | 321.92 |
| 6/27/14 | 187.246 | 321.907 |
| 6/30/14 | 187.28 | 321.988 |
| 7/1/14 | 186.985 | 321.994 |
| 7/2/14 | 186.597 | 321.974 |
| 7/3/14 | 186.327 | 321.934 |
| 7/7/14 | 186.526 | 321.932 |
| 7/8/14 | 186.93 | 321.735 |
| 7/9/14 | 186.875 | 321.432 |
| 7/10/14 | 187.101 | 320.961 |
| 7/11/14 | 187.261 | 320.984 |
| 7/14/14 | 187.168 | 320.983 |
| 7/15/14 | 187.05 | 320.744 |
| 7/16/14 | 187.124 | 320.402 |
| 7/17/14 | 187.478 | 319.546 |
| 7/18/14 | 187.415 | 319.119 |
| 7/21/14 | 187.552 | 319.067 |
| 7/22/14 | 187.59 | 319.413 |
| 7/23/14 | 187.802 | 320.013 |
| 7/24/14 | 187.45 | 320.044 |
| 7/25/14 | 187.698 | 320.029 |
| 7/28/14 | 187.674 | 319.769 |
| 7/29/14 | 187.837 | 319.656 |
| 7/30/14 | 187.301 | 319.047 |
| 7/31/14 | 186.886 | 316.528 |
| 8/1/14 | 187.092 | 314.942 |
| 8/4/14 | 187.413 | 315.476 |
| 8/5/14 | 187.252 | 316.358 |
| 8/6/14 | 187.363 | 316.277 |
| 8/7/14 | 187.673 | 316.579 |
| 8/8/14 | 187.896 | 316.826 |
| 8/11/14 | 187.77 | 317.856 |
| 8/12/14 | 187.676 | 318.383 |
| 8/13/14 | 187.876 | 319.344 |
| 8/14/14 | 188.161 | 319.663 |
| 8/15/14 | 188.62 | 319.986 |
| 8/18/14 | 188.479 | 320.831 |
| 8/19/14 | 188.396 | 321.336 |
| 8/20/14 | 188.206 | 321.492 |
| 8/21/14 | 188.347 | 321.61 |
| 8/22/14 | 188.447 | 321.622 |
| 8/25/14 | 188.701 | 321.818 |
| 8/26/14 | 188.792 | 322.093 |
| 8/27/14 | 188.959 | 322.039 |
| 8/28/14 | 189.247 | 322.212 |
| 8/29/14 | 189.332 | 322.307 |
| 9/2/14 | 188.727 | 321.963 |
| 9/3/14 | 188.618 | 321.632 |
| 9/4/14 | 188.349 | 321.109 |
| 9/5/14 | 188.346 | 320.463 |
| 9/8/14 | 188.284 | 320.285 |
| 9/9/14 | 187.806 | 319.5 |
| 9/10/14 | 187.427 | 318.374 |
| 9/11/14 | 187.429 | 317.872 |
| 9/12/14 | 186.837 | 317.625 |
| 9/15/14 | 186.884 | 317.32 |
| 9/16/14 | 186.942 | 316.989 |
| 9/17/14 | 186.928 | 317.395 |
| 9/18/14 | 186.65 | 317.716 |
| 9/19/14 | 186.954 | 318.104 |
| 9/22/14 | 187.276 | 317.886 |
| 9/23/14 | 187.426 | 316.785 |
| 9/24/14 | 187.209 | 316.242 |
| 9/25/14 | 187.279 | 314.369 |
| 9/26/14 | 186.843 | 313.067 |
| 9/29/14 | 187.044 | 312.227 |
| 9/30/14 | 187.078 | 313.839 |
| 10/1/14 | 187.741 | 314.5 |
| 10/2/14 | 187.805 | 314.68 |
| 10/3/14 | 187.775 | 315.764 |
| 10/6/14 | 188.229 | 316.652 |
| 10/7/14 | 188.613 | 315.906 |
| 10/8/14 | 188.736 | 315.449 |
| 10/9/14 | 188.86 | 314.322 |
| 10/10/14 | 188.827 | 312.945 |
| 10/13/14 | 188.921 | 313.229 |
| 10/14/14 | 189.474 | 311.473 |
| 10/15/14 | 190.361 | 309.937 |
| 10/16/14 | 189.617 | 311.032 |
| 10/17/14 | 189.527 | 315.087 |
| 10/20/14 | 189.692 | 315.391 |
| 10/21/14 | 189.622 | 317.481 |
| 10/22/14 | 189.473 | 317.828 |
| 10/23/14 | 189.056 | 318.169 |
| 10/24/14 | 189.113 | 318.268 |
| 10/27/14 | 189.192 | 317.999 |
| 10/28/14 | 189.053 | 318.308 |
| 10/29/14 | 188.673 | 318.003 |
| 10/30/14 | 188.788 | 317.85 |
| 10/31/14 | 188.531 | 318.489 |
| 11/3/14 | 188.389 | 318.666 |
| 11/4/14 | 188.42 | 317.568 |
| 11/5/14 | 188.206 | 317.764 |
| 11/6/14 | 188.056 | 317.831 |
| 11/7/14 | 188.309 | 317.73 |
| 11/10/14 | 188.303 | 318.028 |
| 11/11/14 | 188.337 | 318.366 |
| 11/12/14 | 188.151 | 317.973 |
| 11/13/14 | 188.062 | 317.544 |
| 11/14/14 | 188.002 | 316.97 |
| 11/17/14 | 187.855 | 316.264 |
| 11/18/14 | 187.783 | 315.504 |
| 11/19/14 | 187.533 | 314.749 |
| 11/20/14 | 187.762 | 314.823 |
| 11/21/14 | 188.187 | 315.646 |
| 11/24/14 | 188.506 | 316.096 |
| 11/25/14 | 188.832 | 316.289 |
| 11/26/14 | 189.221 | 316.481 |
| 11/28/14 | 189.453 | 316.019 |
| 12/1/14 | 189.339 | 313.923 |
| 12/2/14 | 188.594 | 312.837 |
| 12/3/14 | 188.505 | 313.025 |
| 12/4/14 | 188.701 | 312.974 |
| 12/5/14 | 188.301 | 312.533 |
| 12/8/14 | 188.448 | 311.404 |
| 12/9/14 | 188.664 | 309.375 |
| 12/10/14 | 188.681 | 307.796 |
| 12/11/14 | 188.559 | 307.125 |
| 12/12/14 | 188.929 | 305.319 |
| 12/15/14 | 188.561 | 303.76 |
| 12/16/14 | 188.411 | 302.104 |
| 12/17/14 | 188.632 | 304.814 |
| 12/18/14 | 188.376 | 308.594 |
| 12/19/14 | 188.733 | 309.774 |
| 12/22/14 | 188.996 | 310.688 |
| 12/23/14 | 188.785 | 311.246 |
| 12/24/14 | 188.507 | 311.397 |
| 12/26/14 | 188.632 | 311.433 |
| 12/29/14 | 188.966 | 311.834 |
| 12/30/14 | 189.326 | 311.52 |
| 12/31/14 | 189.333 | 311.585 |